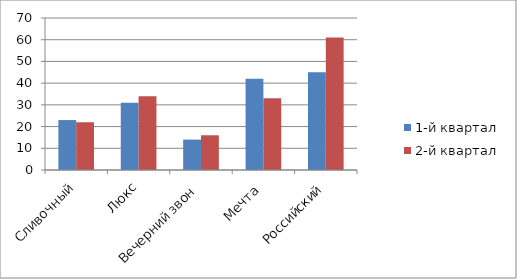
| Category | 1-й квартал | 2-й квартал |
|---|---|---|
| Сливочный | 23 | 22 |
| Люкс | 31 | 34 |
| Вечерний звон | 14 | 16 |
| Мечта | 42 | 33 |
| Российский | 45 | 61 |